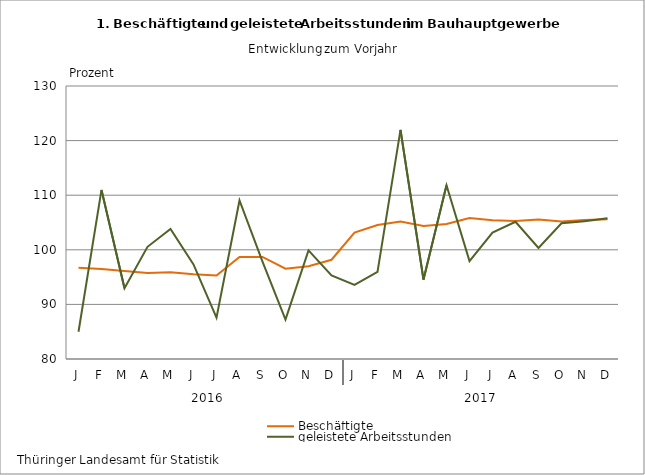
| Category | Beschäftigte | geleistete Arbeitsstunden |
|---|---|---|
| J | 96.707 | 84.989 |
| F | 96.478 | 110.96 |
| M | 96.119 | 92.946 |
| A | 95.745 | 100.548 |
| M | 95.89 | 103.795 |
| J | 95.505 | 97.32 |
| J | 95.294 | 87.569 |
| A | 98.693 | 109.037 |
| S | 98.688 | 97.837 |
| O | 96.541 | 87.235 |
| N | 97.004 | 99.902 |
| D | 98.178 | 95.304 |
| J | 103.139 | 93.576 |
| F | 104.535 | 95.949 |
| M | 105.181 | 121.967 |
| A | 104.377 | 94.555 |
| M | 104.743 | 111.837 |
| J | 105.832 | 97.936 |
| J | 105.417 | 103.154 |
| A | 105.267 | 105.141 |
| S | 105.564 | 100.35 |
| O | 105.19 | 104.867 |
| N | 105.464 | 105.217 |
| D | 105.575 | 105.768 |